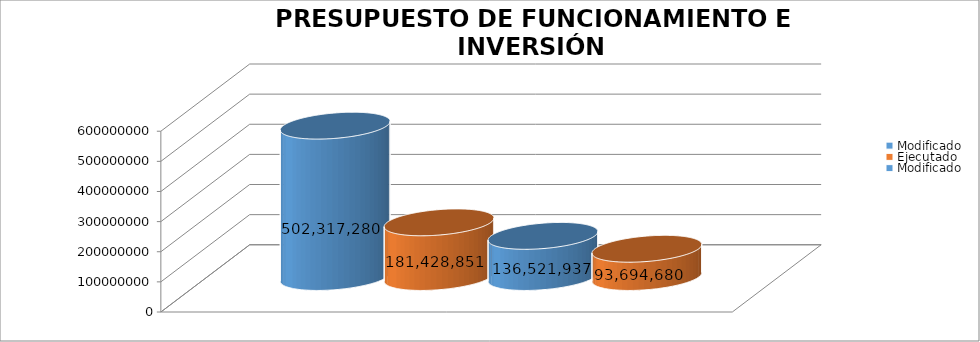
| Category | Modificado | Ejecutado | Series 2 |
|---|---|---|---|
| 0 | 136521937 | 93694679.58 |  |